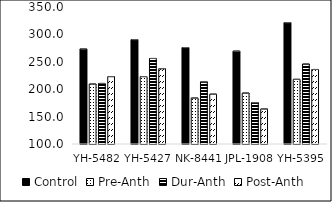
| Category | Control | Pre-Anth | Dur-Anth | Post-Anth |
|---|---|---|---|---|
| YH-5482 | 273.5 | 209.5 | 210.5 | 223 |
| YH-5427 | 290.5 | 223 | 256.1 | 237.5 |
| NK-8441 | 276 | 184 | 213.5 | 191 |
| JPL-1908 | 269.5 | 193 | 175.5 | 164 |
| YH-5395 | 321.5 | 218 | 246 | 236 |